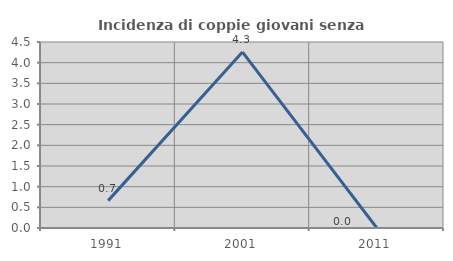
| Category | Incidenza di coppie giovani senza figli |
|---|---|
| 1991.0 | 0.662 |
| 2001.0 | 4.255 |
| 2011.0 | 0 |